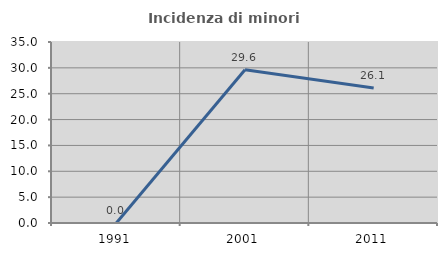
| Category | Incidenza di minori stranieri |
|---|---|
| 1991.0 | 0 |
| 2001.0 | 29.63 |
| 2011.0 | 26.115 |